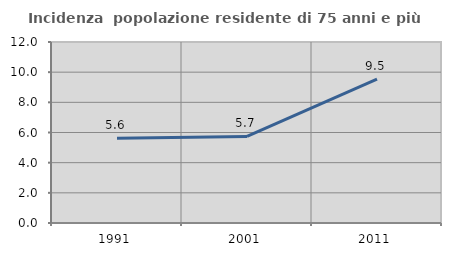
| Category | Incidenza  popolazione residente di 75 anni e più |
|---|---|
| 1991.0 | 5.625 |
| 2001.0 | 5.737 |
| 2011.0 | 9.535 |